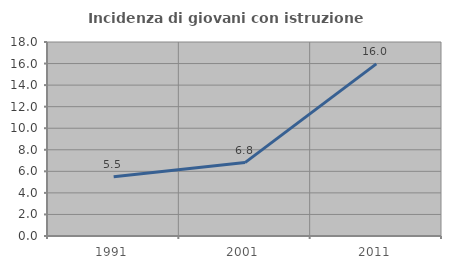
| Category | Incidenza di giovani con istruzione universitaria |
|---|---|
| 1991.0 | 5.495 |
| 2001.0 | 6.81 |
| 2011.0 | 15.97 |